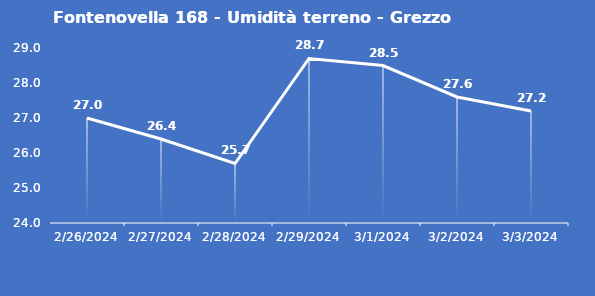
| Category | Fontenovella 168 - Umidità terreno - Grezzo (%VWC) |
|---|---|
| 2/26/24 | 27 |
| 2/27/24 | 26.4 |
| 2/28/24 | 25.7 |
| 2/29/24 | 28.7 |
| 3/1/24 | 28.5 |
| 3/2/24 | 27.6 |
| 3/3/24 | 27.2 |